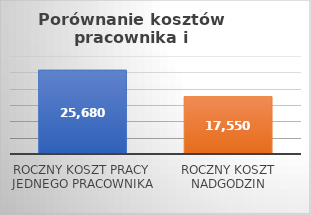
| Category | Wartość w PLN |
|---|---|
| Roczny koszt pracy jednego pracownika | 25680 |
| Roczny koszt nadgodzin | 17550 |